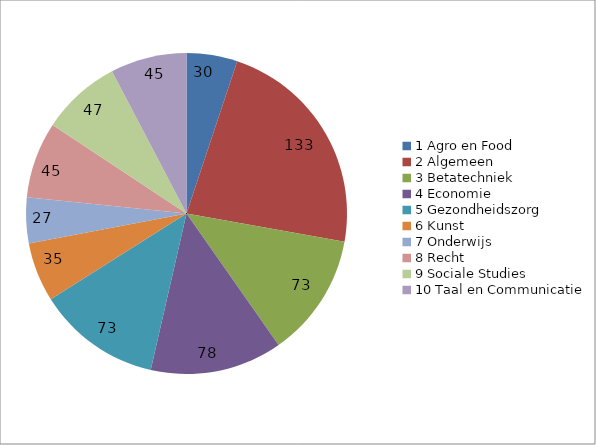
| Category | Series 0 |
|---|---|
| 0 | 30 |
| 1 | 133 |
| 2 | 73 |
| 3 | 78 |
| 4 | 73 |
| 5 | 35 |
| 6 | 27 |
| 7 | 45 |
| 8 | 47 |
| 9 | 45 |